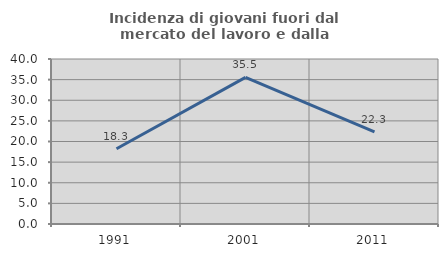
| Category | Incidenza di giovani fuori dal mercato del lavoro e dalla formazione  |
|---|---|
| 1991.0 | 18.254 |
| 2001.0 | 35.539 |
| 2011.0 | 22.34 |